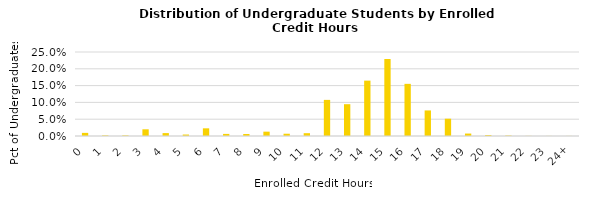
| Category | Ugrad Total |
|---|---|
| 0 | 0.009 |
| 1 | 0.002 |
| 2 | 0.002 |
| 3 | 0.02 |
| 4 | 0.009 |
| 5 | 0.004 |
| 6 | 0.023 |
| 7 | 0.006 |
| 8 | 0.006 |
| 9 | 0.013 |
| 10 | 0.007 |
| 11 | 0.008 |
| 12 | 0.108 |
| 13 | 0.095 |
| 14 | 0.165 |
| 15 | 0.229 |
| 16 | 0.155 |
| 17 | 0.076 |
| 18 | 0.052 |
| 19 | 0.007 |
| 20 | 0.003 |
| 21 | 0.001 |
| 22 | 0 |
| 23 | 0 |
| 24+ | 0 |